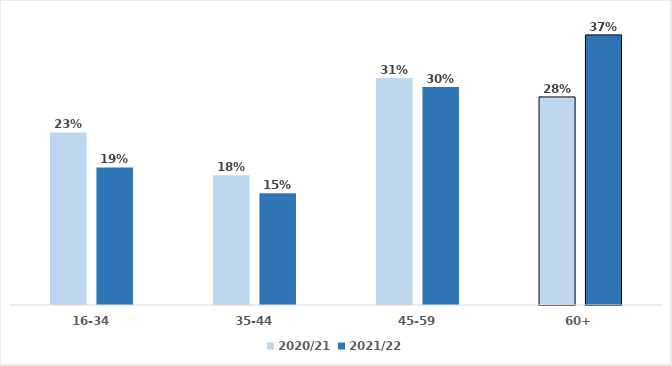
| Category | 2020/21 | 2021/22 |
|---|---|---|
| 16-34 | 0.234 | 0.187 |
| 35-44 | 0.176 | 0.151 |
| 45-59 | 0.308 | 0.296 |
| 60+ | 0.282 | 0.366 |